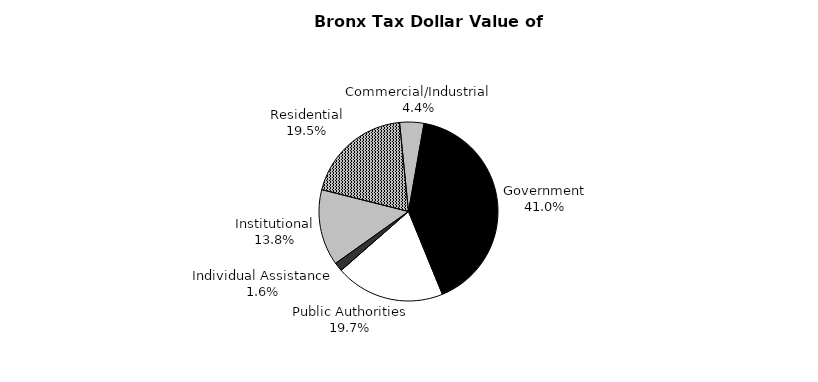
| Category | Series 0 |
|---|---|
| Government | 736032618 |
| Public Authorities | 354030959 |
| Individual Assistance | 28702542 |
| Institutional | 246990401 |
| Residential | 349232325 |
| Commercial/Industrial | 78426196 |